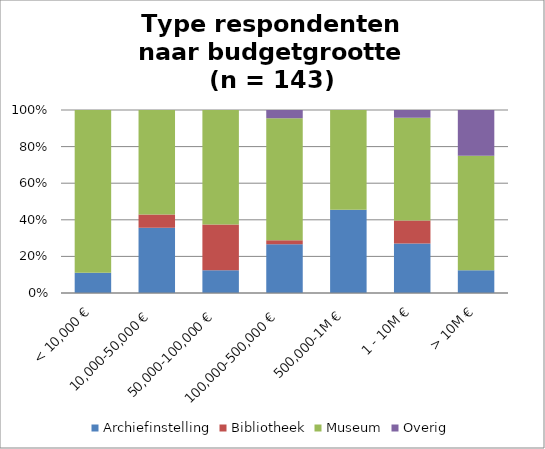
| Category | Archiefinstelling | Bibliotheek | Museum | Overig |
|---|---|---|---|---|
| < 10,000 € | 1 | 0 | 8 | 0 |
| 10,000-50,000 € | 5 | 1 | 8 | 0 |
| 50,000-100,000 € | 1 | 2 | 5 | 0 |
| 100,000-500,000 € | 12 | 1 | 30 | 2 |
| 500,000-1M € | 5 | 0 | 6 | 0 |
| 1 - 10M € | 13 | 6 | 27 | 2 |
| > 10M € | 1 | 0 | 5 | 2 |